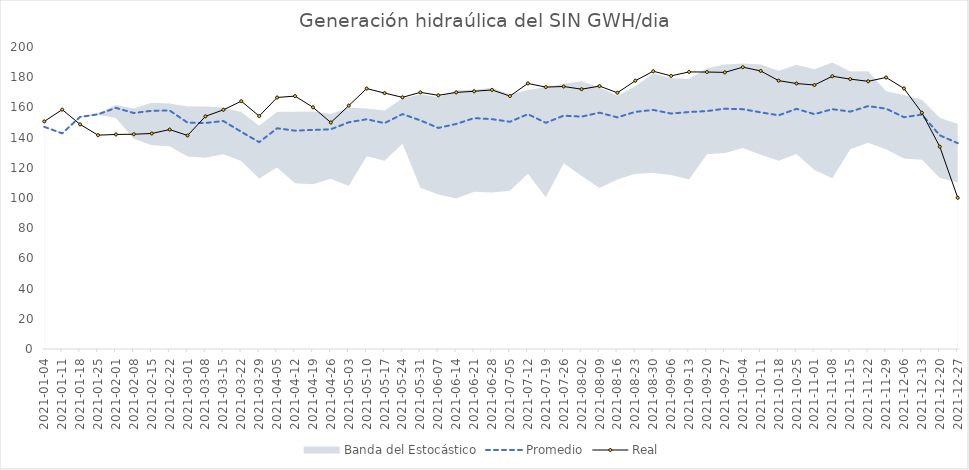
| Category | Promedio | Real |
|---|---|---|
| 2021-01-04 | 147.143 | 150.732 |
| 2021-01-11 | 142.799 | 158.527 |
| 2021-01-18 | 153.686 | 148.746 |
| 2021-01-25 | 155.4 | 141.612 |
| 2021-02-01 | 159.686 | 142.08 |
| 2021-02-08 | 156.271 | 142.238 |
| 2021-02-15 | 157.786 | 142.728 |
| 2021-02-22 | 157.957 | 145.331 |
| 2021-03-01 | 149.9 | 141.394 |
| 2021-03-08 | 149.657 | 154.094 |
| 2021-03-15 | 151 | 158.39 |
| 2021-03-22 | 143.814 | 164.119 |
| 2021-03-29 | 136.964 | 154.261 |
| 2021-04-05 | 146.171 | 166.561 |
| 2021-04-12 | 144.6 | 167.479 |
| 2021-04-19 | 145.086 | 160.07 |
| 2021-04-26 | 145.5 | 149.986 |
| 2021-05-03 | 150.157 | 161.16 |
| 2021-05-10 | 152.143 | 172.481 |
| 2021-05-17 | 149.571 | 169.471 |
| 2021-05-24 | 155.586 | 166.672 |
| 2021-05-31 | 151.386 | 169.959 |
| 2021-06-07 | 146.4 | 167.997 |
| 2021-06-14 | 149.057 | 169.937 |
| 2021-06-21 | 152.914 | 170.681 |
| 2021-06-28 | 152.214 | 171.57 |
| 2021-07-05 | 150.486 | 167.507 |
| 2021-07-12 | 155.514 | 175.888 |
| 2021-07-19 | 149.8 | 173.445 |
| 2021-07-26 | 154.514 | 173.86 |
| 2021-08-02 | 153.9 | 172.056 |
| 2021-08-09 | 156.514 | 174.113 |
| 2021-08-16 | 153.386 | 169.679 |
| 2021-08-23 | 157.057 | 177.663 |
| 2021-08-30 | 158.329 | 183.947 |
| 2021-09-06 | 155.914 | 180.879 |
| 2021-09-13 | 156.943 | 183.502 |
| 2021-09-20 | 157.557 | 183.418 |
| 2021-09-27 | 159.143 | 183.192 |
| 2021-10-04 | 158.829 | 186.636 |
| 2021-10-11 | 156.714 | 184.156 |
| 2021-10-18 | 154.771 | 177.713 |
| 2021-10-25 | 159.029 | 175.809 |
| 2021-11-01 | 155.529 | 174.825 |
| 2021-11-08 | 158.829 | 180.631 |
| 2021-11-15 | 157.214 | 178.734 |
| 2021-11-22 | 160.857 | 177.271 |
| 2021-11-29 | 159.171 | 179.824 |
| 2021-12-06 | 153.486 | 172.547 |
| 2021-12-13 | 155.243 | 156.461 |
| 2021-12-20 | 141.484 | 133.962 |
| 2021-12-27 | 136.321 | 100.138 |